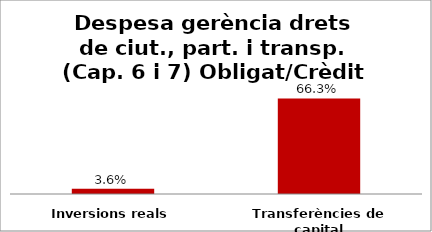
| Category | Series 0 |
|---|---|
| Inversions reals | 0.036 |
| Transferències de capital | 0.663 |